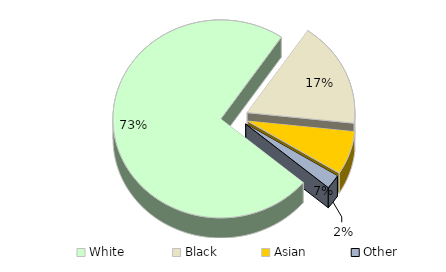
| Category | New York |
|---|---|
| White  | 0.734 |
| Black | 0.172 |
| Asian | 0.071 |
| Other | 0.023 |